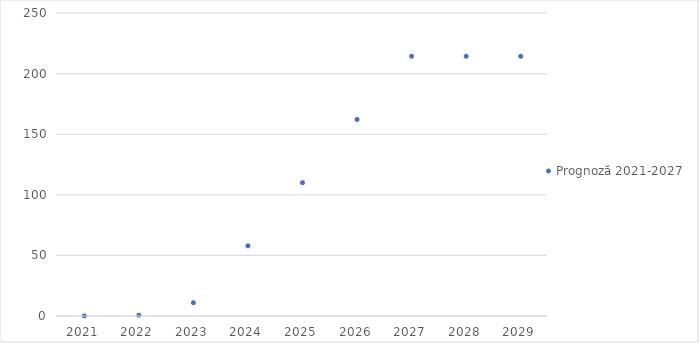
| Category | Prognoză 2021-2027 |
|---|---|
| 2021.0 | 0.113 |
| 2022.0 | 0.679 |
| 2023.0 | 10.969 |
| 2024.0 | 57.899 |
| 2025.0 | 110.031 |
| 2026.0 | 162.163 |
| 2027.0 | 214.295 |
| 2028.0 | 214.295 |
| 2029.0 | 214.295 |